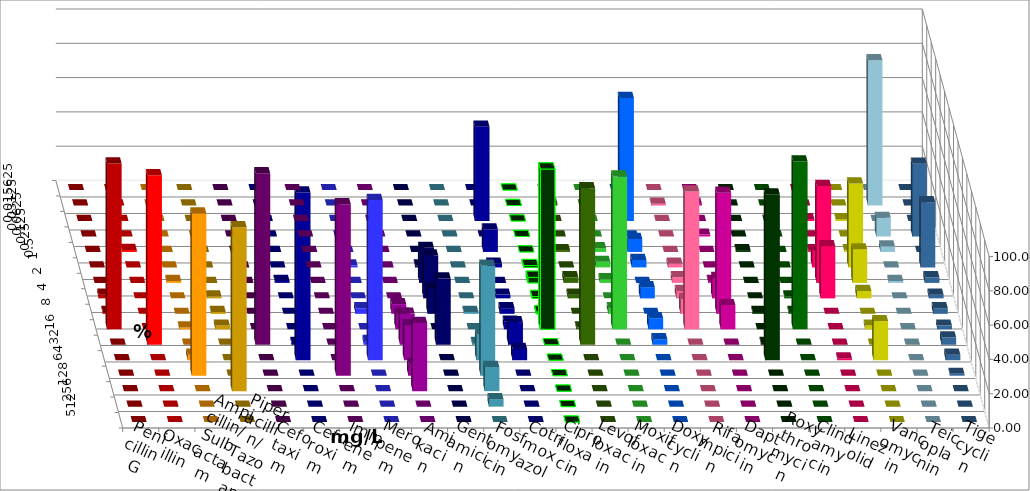
| Category | Penicillin G | Oxacillin | Ampicillin/ Sulbactam | Piperacillin/ Tazobactam | Cefotaxim | Cefuroxim | Imipenem | Meropenem | Amikacin | Gentamicin | Fosfomycin | Cotrimoxazol | Ciprofloxacin | Levofloxacin | Moxifloxacin | Doxycyclin | Rifampicin | Daptomycin | Roxythromycin | Clindamycin | Linezolid | Vancomycin | Teicoplanin | Tigecyclin |
|---|---|---|---|---|---|---|---|---|---|---|---|---|---|---|---|---|---|---|---|---|---|---|---|---|
| 0.015625 | 0 | 0 | 0 | 0 | 0 | 0 | 0 | 0 | 0 | 0 | 0 | 0 | 0 | 0 | 0 | 0 | 0 | 0 | 0 | 0 | 0 | 0 | 0 | 0 |
| 0.03125 | 0 | 0 | 0 | 0 | 0 | 0 | 0 | 0 | 0 | 0 | 0 | 0 | 0 | 1.087 | 0 | 0 | 1.087 | 1.087 | 0 | 0 | 0 | 0 | 0 | 84.783 |
| 0.0625 | 0 | 0 | 0 | 0 | 0 | 0 | 0 | 0 | 0 | 0 | 0 | 54.945 | 0 | 0 | 0 | 71.739 | 0 | 0 | 0 | 0 | 1.087 | 1.087 | 0 | 0 |
| 0.125 | 0 | 0 | 0 | 0 | 0 | 0 | 0 | 0 | 0 | 0 | 0 | 0 | 0 | 0 | 0 | 0 | 0 | 1.087 | 0 | 0 | 0 | 0 | 42.391 | 10.87 |
| 0.25 | 0 | 1.099 | 0 | 0 | 0 | 0 | 0 | 0 | 0 | 0 | 0 | 13.187 | 0 | 1.087 | 2.174 | 7.609 | 0 | 0 | 1.087 | 0 | 1.087 | 1.087 | 0 | 3.261 |
| 0.5 | 0 | 0 | 0 | 0 | 0 | 0 | 0 | 1.087 | 0 | 1.136 | 0 | 2.198 | 1.087 | 0 | 3.261 | 4.348 | 2.174 | 0 | 0 | 0 | 9.783 | 48.913 | 38.043 | 0 |
| 1.0 | 0 | 0 | 1.087 | 0 | 0 | 0 | 1.087 | 0 | 0 | 20.455 | 0 | 0 | 3.261 | 3.261 | 2.174 | 0 | 3.261 | 1.087 | 0 | 0 | 56.522 | 19.565 | 3.261 | 1.087 |
| 2.0 | 2.174 | 0 | 0 | 1.087 | 0 | 0 | 0 | 0 | 0 | 25 | 0 | 2.198 | 1.087 | 2.174 | 0 | 6.522 | 4.348 | 11.957 | 0 | 1.087 | 30.435 | 4.348 | 2.174 | 0 |
| 4.0 | 1.087 | 0 | 0 | 1.087 | 0 | 0 | 0 | 3.261 | 5.682 | 14.773 | 1.087 | 3.297 | 1.087 | 0 | 3.261 | 0 | 8.696 | 70.652 | 1.087 | 1.087 | 0 | 0 | 3.261 | 0 |
| 8.0 | 96.739 | 0 | 1.087 | 2.174 | 0 | 0 | 0 | 0 | 9.091 | 0 | 0 | 4.396 | 93.478 | 1.087 | 89.13 | 6.522 | 80.435 | 14.13 | 0 | 97.826 | 0 | 2.174 | 2.174 | 0 |
| 16.0 | 0 | 98.901 | 0 | 0 | 100 | 0 | 1.087 | 2.174 | 18.182 | 38.636 | 1.087 | 13.187 | 0 | 91.304 | 0 | 3.261 | 0 | 0 | 1.087 | 0 | 0 | 0 | 4.348 | 0 |
| 32.0 | 0 | 0 | 3.261 | 0 | 0 | 0 | 97.826 | 93.478 | 20.455 | 0 | 15.217 | 6.593 | 0 | 0 | 0 | 0 | 0 | 0 | 96.739 | 0 | 1.087 | 22.826 | 3.261 | 0 |
| 64.0 | 0 | 0 | 94.565 | 0 | 0 | 100 | 0 | 0 | 6.818 | 0 | 64.13 | 0 | 0 | 0 | 0 | 0 | 0 | 0 | 0 | 0 | 0 | 0 | 1.087 | 0 |
| 128.0 | 0 | 0 | 0 | 95.652 | 0 | 0 | 0 | 0 | 39.773 | 0 | 14.13 | 0 | 0 | 0 | 0 | 0 | 0 | 0 | 0 | 0 | 0 | 0 | 0 | 0 |
| 256.0 | 0 | 0 | 0 | 0 | 0 | 0 | 0 | 0 | 0 | 0 | 4.348 | 0 | 0 | 0 | 0 | 0 | 0 | 0 | 0 | 0 | 0 | 0 | 0 | 0 |
| 512.0 | 0 | 0 | 0 | 0 | 0 | 0 | 0 | 0 | 0 | 0 | 0 | 0 | 0 | 0 | 0 | 0 | 0 | 0 | 0 | 0 | 0 | 0 | 0 | 0 |